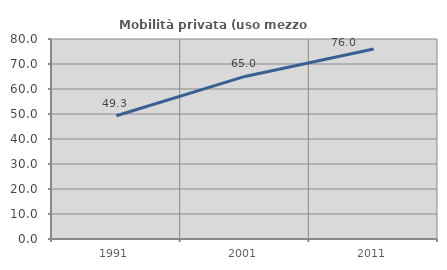
| Category | Mobilità privata (uso mezzo privato) |
|---|---|
| 1991.0 | 49.298 |
| 2001.0 | 65.029 |
| 2011.0 | 75.981 |